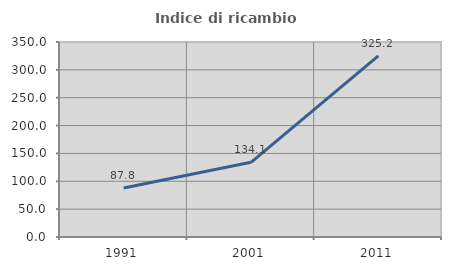
| Category | Indice di ricambio occupazionale  |
|---|---|
| 1991.0 | 87.85 |
| 2001.0 | 134.12 |
| 2011.0 | 325.243 |